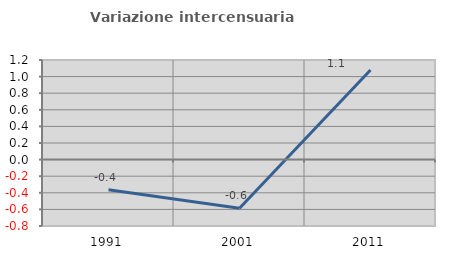
| Category | Variazione intercensuaria annua |
|---|---|
| 1991.0 | -0.363 |
| 2001.0 | -0.587 |
| 2011.0 | 1.079 |